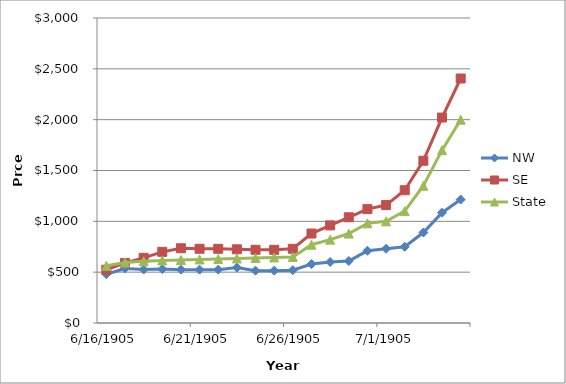
| Category | NW | SE | State |
|---|---|---|---|
| 1994.0 | 480 | 524 | 563 |
| 1995.0 | 536 | 591 | 595 |
| 1996.0 | 526 | 641 | 607 |
| 1997.0 | 530 | 700 | 615 |
| 1998.0 | 525 | 735 | 620 |
| 1999.0 | 525 | 730 | 625 |
| 2000.0 | 525 | 730 | 630 |
| 2001.0 | 545 | 725 | 635 |
| 2002.0 | 515 | 720 | 640 |
| 2003.0 | 515 | 720 | 645 |
| 2004.0 | 520 | 730 | 650 |
| 2005.0 | 580 | 880 | 770 |
| 2006.0 | 600 | 960 | 820 |
| 2007.0 | 610 | 1040 | 880 |
| 2008.0 | 710 | 1120 | 980 |
| 2009.0 | 730 | 1160 | 1000 |
| 2010.0 | 750 | 1306 | 1100 |
| 2011.0 | 890 | 1596 | 1350 |
| 2012.0 | 1085 | 2021 | 1700 |
| 2013.0 | 1214 | 2405 | 2000 |